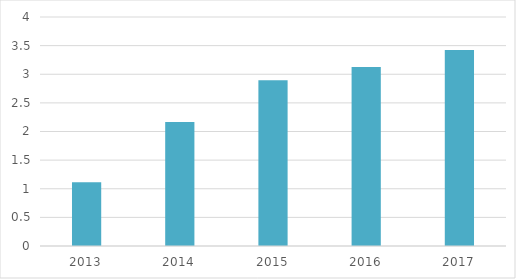
| Category | КООС |
|---|---|
| 2013.0 | 1.113 |
| 2014.0 | 2.167 |
| 2015.0 | 2.893 |
| 2016.0 | 3.125 |
| 2017.0 | 3.422 |